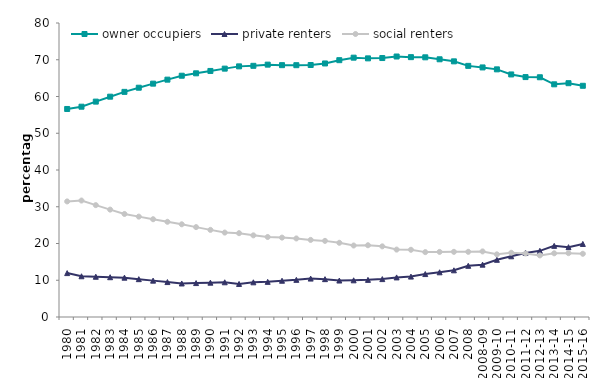
| Category | owner occupiers | private renters | social renters |
|---|---|---|---|
| 1980 | 56.605 | 11.947 | 31.448 |
| 1981 | 57.226 | 11.085 | 31.689 |
| 1982 | 58.607 | 10.954 | 30.439 |
| 1983 | 59.951 | 10.827 | 29.223 |
| 1984 | 61.26 | 10.702 | 28.038 |
| 1985 | 62.39 | 10.296 | 27.314 |
| 1986 | 63.499 | 9.897 | 26.604 |
| 1987 | 64.586 | 9.506 | 25.908 |
| 1988 | 65.652 | 9.123 | 25.225 |
| 1989 | 66.309 | 9.233 | 24.458 |
| 1990 | 66.952 | 9.341 | 23.708 |
| 1991 | 67.582 | 9.446 | 22.973 |
| 1992 | 68.198 | 8.994 | 22.808 |
| 1993 | 68.347 | 9.436 | 22.217 |
| 1994 | 68.672 | 9.559 | 21.769 |
| 1995 | 68.528 | 9.869 | 21.603 |
| 1996 | 68.518 | 10.109 | 21.373 |
| 1997 | 68.567 | 10.454 | 20.979 |
| 1998 | 68.989 | 10.299 | 20.713 |
| 1999 | 69.884 | 9.921 | 20.194 |
| 2000 | 70.568 | 9.979 | 19.453 |
| 2001 | 70.374 | 10.103 | 19.523 |
| 2002 | 70.464 | 10.313 | 19.223 |
| 2003 | 70.883 | 10.773 | 18.343 |
| 2004 | 70.709 | 10.999 | 18.292 |
| 2005 | 70.663 | 11.681 | 17.656 |
| 2006 | 70.124 | 12.161 | 17.715 |
| 2007 | 69.565 | 12.706 | 17.729 |
| 2008 | 68.334 | 13.93 | 17.737 |
| 2008-09 | 67.91 | 14.246 | 17.844 |
| 2009-10 | 67.386 | 15.565 | 17.049 |
| 2010-11 | 66.003 | 16.521 | 17.476 |
| 2011-12 | 65.283 | 17.438 | 17.279 |
| 2012-13 | 65.236 | 18.001 | 16.763 |
| 2013-14 | 63.313 | 19.354 | 17.334 |
| 2014-15 | 63.622 | 19.003 | 17.375 |
| 2015-16 | 62.916 | 19.881 | 17.203 |